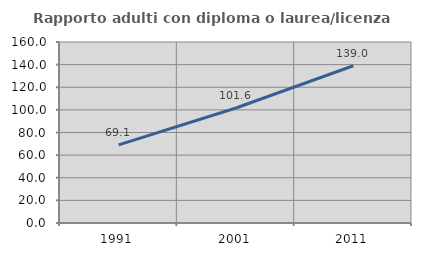
| Category | Rapporto adulti con diploma o laurea/licenza media  |
|---|---|
| 1991.0 | 69.118 |
| 2001.0 | 101.639 |
| 2011.0 | 138.983 |